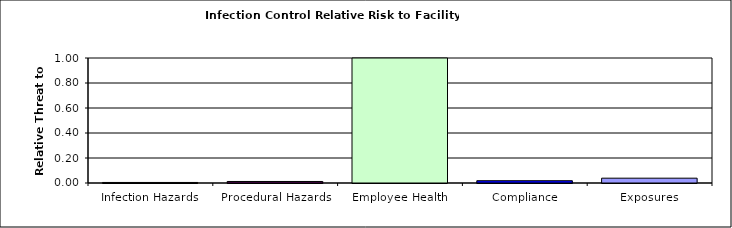
| Category | Series 0 |
|---|---|
| Infection Hazards | 0.004 |
| Procedural Hazards | 0.012 |
| Employee Health | 1 |
| Compliance | 0.018 |
| Exposures | 0.039 |